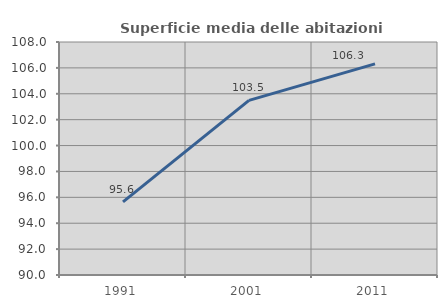
| Category | Superficie media delle abitazioni occupate |
|---|---|
| 1991.0 | 95.644 |
| 2001.0 | 103.491 |
| 2011.0 | 106.314 |